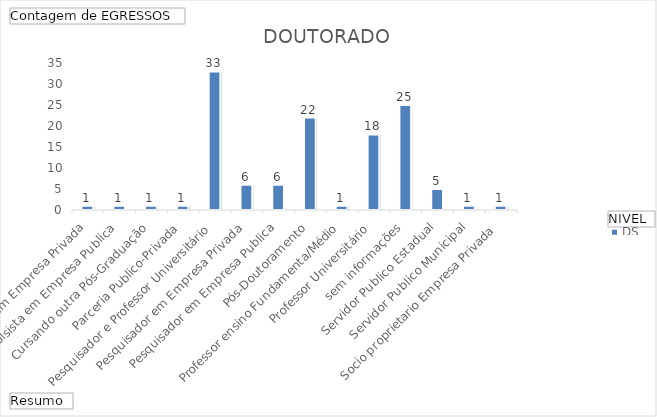
| Category | DS |
|---|---|
| Atua em Empresa Privada | 1 |
| Bolsista em Empresa Publica | 1 |
| Cursando outra Pós-Graduação | 1 |
| Parceria Publico-Privada | 1 |
| Pesquisador e Professor Universitário | 33 |
| Pesquisador em Empresa Privada | 6 |
| Pesquisador em Empresa Publica | 6 |
| Pós-Doutoramento | 22 |
| Professor ensino Fundamenta/Médio | 1 |
| Professor Universitário | 18 |
| sem informações | 25 |
| Servidor Publico Estadual | 5 |
| Servidor Publico Municipal | 1 |
| Socio proprietario Empresa Privada  | 1 |